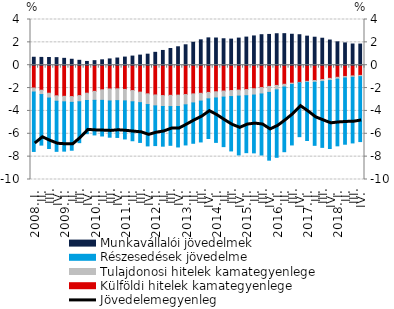
| Category | Külföldi hitelek kamategyenlege | Tulajdonosi hitelek kamategyenlege | Részesedések jövedelme  | Munkavállalói jövedelmek |
|---|---|---|---|---|
| 2008. I. | -1.997 | -0.349 | -5.198 | 0.697 |
|          II. | -2.187 | -0.382 | -4.423 | 0.683 |
|          III. | -2.45 | -0.422 | -4.416 | 0.675 |
|          IV. | -2.678 | -0.475 | -4.383 | 0.664 |
| 2009. I. | -2.722 | -0.483 | -4.313 | 0.602 |
|          II. | -2.744 | -0.505 | -4.19 | 0.521 |
|          III. | -2.661 | -0.538 | -3.577 | 0.429 |
|          IV. | -2.448 | -0.639 | -2.902 | 0.329 |
| 2010. I. | -2.29 | -0.784 | -3.026 | 0.398 |
|          II. | -2.153 | -0.922 | -3.118 | 0.472 |
|          III. | -2.079 | -1.052 | -3.167 | 0.549 |
|          IV. | -2.065 | -1.036 | -3.22 | 0.629 |
| 2011. I. | -2.117 | -1.007 | -3.329 | 0.711 |
|          II. | -2.219 | -0.982 | -3.408 | 0.8 |
|          III. | -2.357 | -0.919 | -3.481 | 0.884 |
|          IV. | -2.505 | -0.939 | -3.617 | 0.966 |
| 2012. I. | -2.601 | -0.957 | -3.474 | 1.128 |
|          II. | -2.658 | -0.955 | -3.472 | 1.292 |
|          III. | -2.636 | -0.983 | -3.389 | 1.461 |
|          IV. | -2.617 | -0.997 | -3.538 | 1.613 |
| 2013. I. | -2.567 | -0.899 | -3.511 | 1.787 |
| II. | -2.508 | -0.792 | -3.53 | 2.009 |
|          III. | -2.46 | -0.679 | -3.575 | 2.222 |
| IV. | -2.381 | -0.564 | -3.468 | 2.392 |
| 2014. I. | -2.323 | -0.543 | -3.887 | 2.38 |
| II. | -2.261 | -0.531 | -4.332 | 2.315 |
|          III. | -2.218 | -0.526 | -4.757 | 2.284 |
| IV. | -2.176 | -0.525 | -5.149 | 2.373 |
| 2015. I. | -2.131 | -0.54 | -4.98 | 2.46 |
| II. | -2.056 | -0.556 | -5.059 | 2.561 |
|          III. | -1.958 | -0.558 | -5.343 | 2.67 |
| IV. | -1.855 | -0.525 | -5.929 | 2.693 |
| 2016. I. | -1.77 | -0.387 | -5.9 | 2.754 |
| II. | -1.668 | -0.239 | -5.66 | 2.761 |
|          III. | -1.571 | -0.12 | -5.286 | 2.709 |
| IV. | -1.503 | -0.042 | -4.707 | 2.668 |
| 2017. I. | -1.408 | -0.093 | -5.089 | 2.543 |
| II. | -1.341 | -0.157 | -5.513 | 2.45 |
|          III. | -1.254 | -0.18 | -5.754 | 2.361 |
| IV. | -1.153 | -0.19 | -5.943 | 2.204 |
| 2018. I. | -1.059 | -0.163 | -5.833 | 2.047 |
| II. | -0.984 | -0.136 | -5.794 | 1.952 |
|          III. | -0.935 | -0.123 | -5.741 | 1.856 |
| IV. | -0.892 | -0.11 | -5.68 | 1.851 |